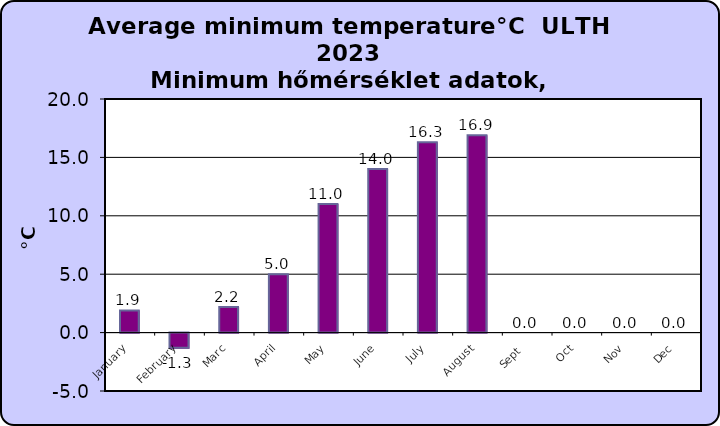
| Category | Series 0 |
|---|---|
| January | 1.9 |
| February | -1.3 |
| Marc | 2.2 |
| April | 5 |
| May | 11 |
| June | 14 |
| July | 16.3 |
| August | 16.9 |
| Sept  | 0 |
| Oct | 0 |
| Nov | 0 |
| Dec | 0 |